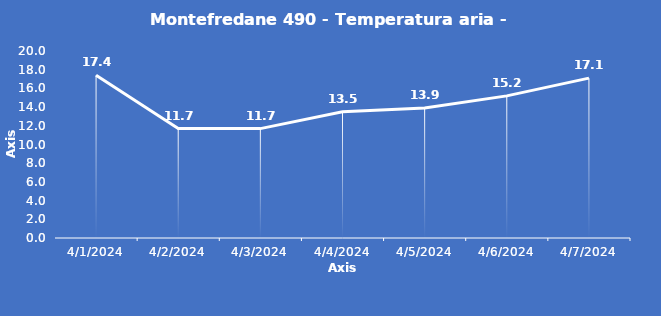
| Category | Montefredane 490 - Temperatura aria - Grezzo (°C) |
|---|---|
| 4/1/24 | 17.4 |
| 4/2/24 | 11.7 |
| 4/3/24 | 11.7 |
| 4/4/24 | 13.5 |
| 4/5/24 | 13.9 |
| 4/6/24 | 15.2 |
| 4/7/24 | 17.1 |